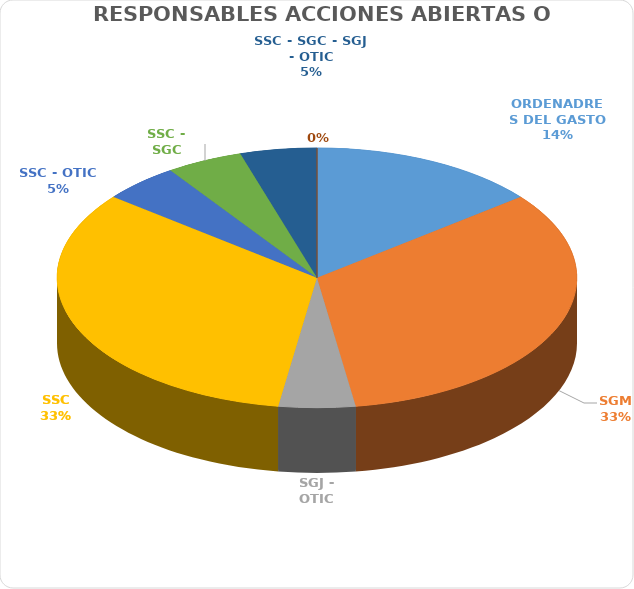
| Category | Series 0 |
|---|---|
| ORDENADRES DEL GASTO | 3 |
| SGM | 7 |
| SGJ - OTIC | 1 |
| SSC | 7 |
| SSC - OTIC  | 1 |
| SSC - SGC | 1 |
| SSC - SGC - SGJ - OTIC | 1 |